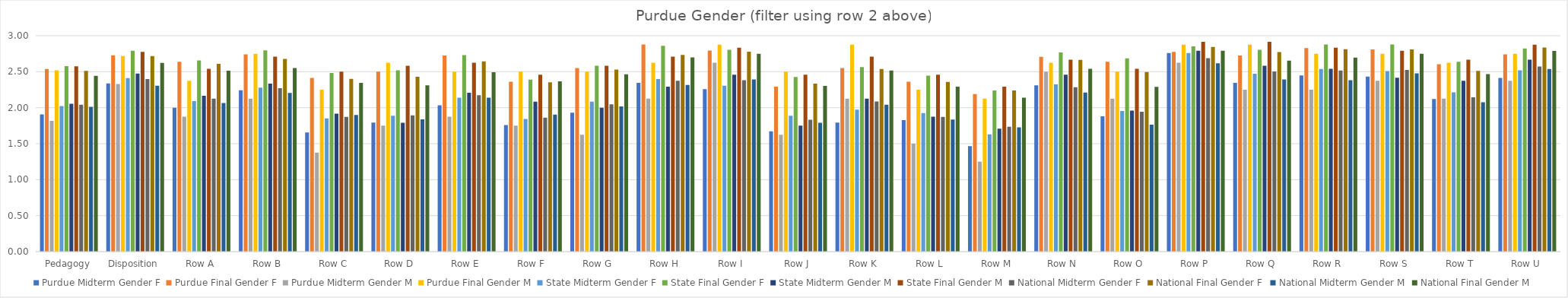
| Category | Purdue | State | National |
|---|---|---|---|
| Pedagogy | 2.519 | 2.574 | 2.442 |
| Disposition | 2.719 | 2.776 | 2.622 |
| Row A | 2.375 | 2.542 | 2.514 |
| Row B | 2.75 | 2.708 | 2.552 |
| Row C | 2.25 | 2.5 | 2.346 |
| Row D | 2.625 | 2.583 | 2.31 |
| Row E | 2.5 | 2.625 | 2.492 |
| Row F | 2.5 | 2.458 | 2.365 |
| Row G | 2.5 | 2.583 | 2.464 |
| Row H | 2.625 | 2.708 | 2.698 |
| Row I | 2.875 | 2.833 | 2.75 |
| Row J | 2.5 | 2.458 | 2.302 |
| Row K | 2.875 | 2.708 | 2.516 |
| Row L | 2.25 | 2.458 | 2.291 |
| Row M | 2.125 | 2.292 | 2.14 |
| Row N | 2.625 | 2.667 | 2.54 |
| Row O | 2.5 | 2.542 | 2.29 |
| Row P | 2.875 | 2.917 | 2.791 |
| Row Q | 2.875 | 2.917 | 2.654 |
| Row R | 2.75 | 2.833 | 2.695 |
| Row S | 2.75 | 2.792 | 2.75 |
| Row T | 2.625 | 2.667 | 2.466 |
| Row U | 2.75 | 2.875 | 2.788 |